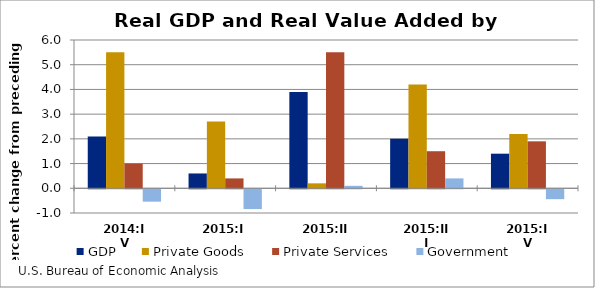
| Category | GDP | Private Goods | Private Services | Government |
|---|---|---|---|---|
| 2014:IV | 2.1 | 5.5 | 1 | -0.5 |
| 2015:I | 0.6 | 2.7 | 0.4 | -0.8 |
| 2015:II | 3.9 | 0.2 | 5.5 | 0.1 |
| 2015:III | 2 | 4.2 | 1.5 | 0.4 |
| 2015:IV | 1.4 | 2.2 | 1.9 | -0.4 |